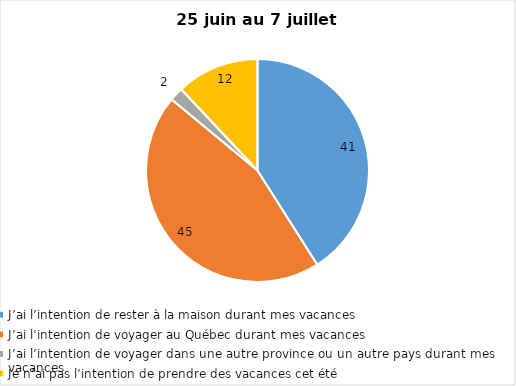
| Category | Series 0 |
|---|---|
| J’ai l’intention de rester à la maison durant mes vacances | 41 |
| J’ai l’intention de voyager au Québec durant mes vacances | 45 |
| J’ai l’intention de voyager dans une autre province ou un autre pays durant mes vacances | 2 |
| Je n’ai pas l’intention de prendre des vacances cet été | 12 |